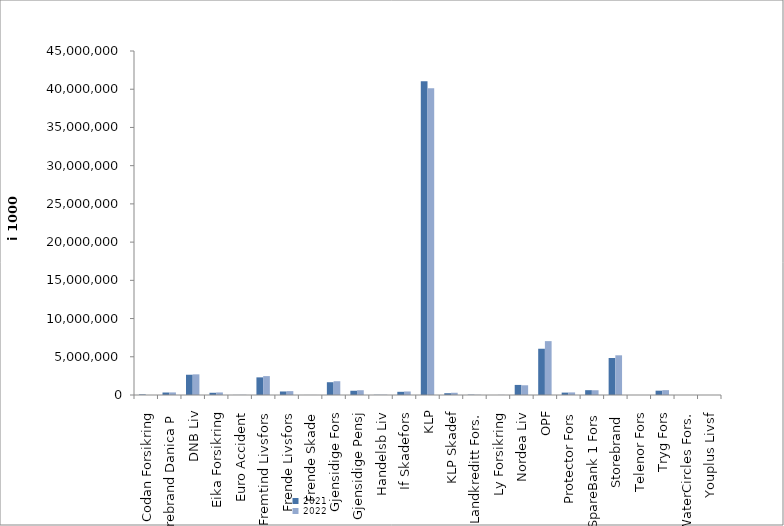
| Category | 2021 | 2022 |
|---|---|---|
| Codan Forsikring | 73022 | 0 |
| Storebrand Danica P | 325384.086 | 337291.249 |
| DNB Liv | 2650494.351 | 2702411 |
| Eika Forsikring | 291419 | 335934 |
| Euro Accident | 10359.612 | 26920 |
| Fremtind Livsfors | 2307250.828 | 2472117.632 |
| Frende Livsfors | 459364 | 507793 |
| Frende Skade | 5330.279 | 6370.085 |
| Gjensidige Fors | 1671885.951 | 1802206.75 |
| Gjensidige Pensj | 556509.5 | 625492 |
| Handelsb Liv | 26025.309 | 37716.661 |
| If Skadefors | 416726.042 | 461957.495 |
| KLP | 41046577.108 | 40116042.617 |
| KLP Skadef | 233574.456 | 293311.632 |
| Landkreditt Fors. | 41337 | 28431 |
| Ly Forsikring | 0 | 16353.946 |
| Nordea Liv | 1318287.205 | 1272563.135 |
| OPF | 6050567 | 7048000 |
| Protector Fors | 313745.285 | 338102.514 |
| SpareBank 1 Fors | 631024.449 | 621880.973 |
| Storebrand  | 4839592.959 | 5192979.767 |
| Telenor Fors | 1014 | 0 |
| Tryg Fors | 566035.48 | 636479 |
| WaterCircles Fors. | 1806 | 2123 |
| Youplus Livsf | 0 | 3579 |